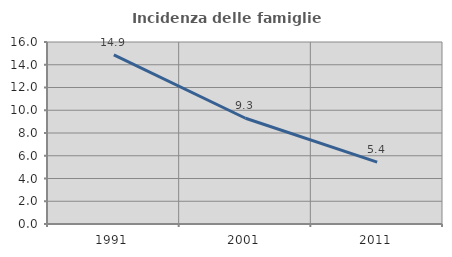
| Category | Incidenza delle famiglie numerose |
|---|---|
| 1991.0 | 14.865 |
| 2001.0 | 9.295 |
| 2011.0 | 5.442 |